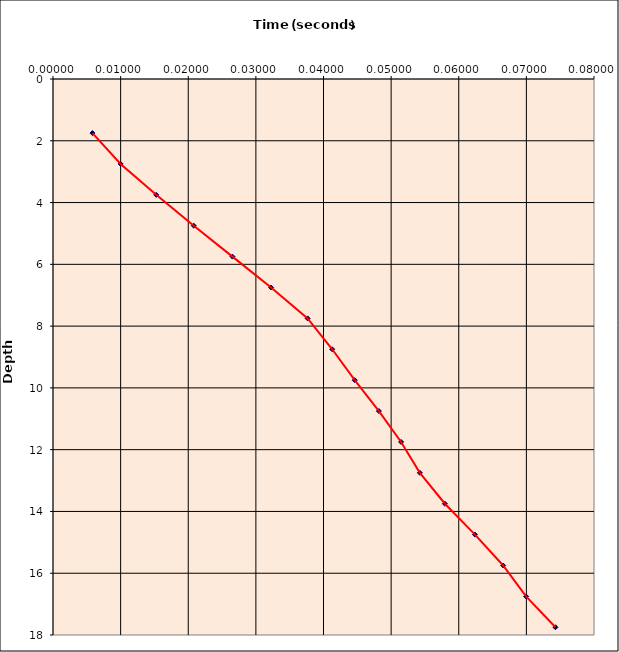
| Category | Series 0 |
|---|---|
| 0.005833333333333334 | 1.75 |
| 0.01 | 2.75 |
| 0.015263157894736843 | 3.75 |
| 0.0208187134502924 | 4.75 |
| 0.026532999164578113 | 5.75 |
| 0.03224728487886383 | 6.75 |
| 0.037652690284269236 | 7.75 |
| 0.041289053920632875 | 8.75 |
| 0.04462238725396621 | 9.75 |
| 0.04819381582539478 | 10.75 |
| 0.051472504349984946 | 11.75 |
| 0.05425028212776272 | 12.75 |
| 0.05795398583146642 | 13.75 |
| 0.06239843027591087 | 14.75 |
| 0.06656509694257753 | 15.75 |
| 0.06995492745105211 | 16.75 |
| 0.07430275353800864 | 17.75 |